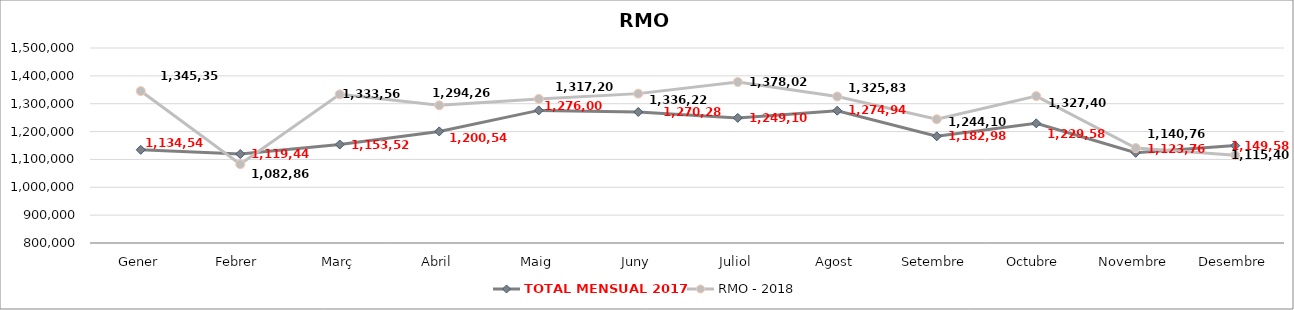
| Category | TOTAL MENSUAL 2017 | RMO - 2018 |
|---|---|---|
| Gener | 1134540 | 1345359 |
| Febrer | 1119440 | 1082860 |
| Març | 1153520 | 1333560 |
| Abril | 1200540 | 1294260 |
| Maig | 1276000 | 1317200 |
| Juny | 1270280 | 1336220 |
| Juliol | 1249100 | 1378020 |
| Agost | 1274940 | 1325839 |
| Setembre | 1182980 | 1244100 |
| Octubre | 1229580 | 1327400 |
| Novembre | 1123760 | 1140760 |
| Desembre | 1149580 | 1115400 |